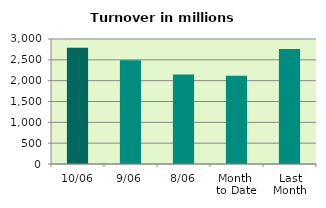
| Category | Series 0 |
|---|---|
| 10/06 | 2790.549 |
| 9/06 | 2491.97 |
| 8/06 | 2149.916 |
| Month 
to Date | 2115.611 |
| Last
Month | 2758.944 |